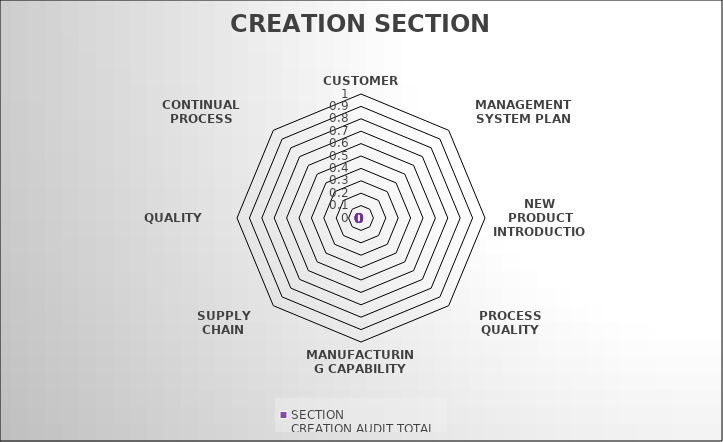
| Category | SECTION 
CREATION AUDIT TOTAL |
|---|---|
| Customer Service | 0 |
| Management System Plan | 0 |
| New Product Introduction Support | 0 |
| Process Quality Management | 0 |
| Manufacturing Capability | 0 |
| Supply Chain Management | 0 |
| Quality Systems | 0 |
| Continual Process Improvement | 0 |